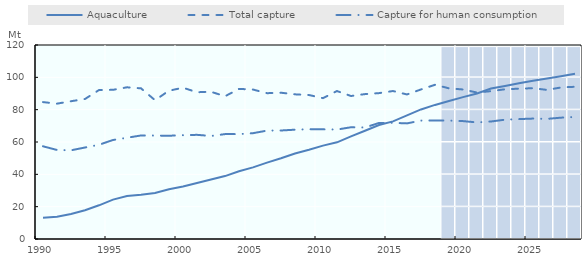
| Category | Projected1 | Projected2 | Projected3 | Projected4 | Projected5 | Projected6 |
|---|---|---|---|---|---|---|
| 1990.0 | 0 | 0 | 0 | 0 | 0 | 0 |
| 1991.0 | 0 | 0 | 0 | 0 | 0 | 0 |
| 1992.0 | 0 | 0 | 0 | 0 | 0 | 0 |
| 1993.0 | 0 | 0 | 0 | 0 | 0 | 0 |
| 1994.0 | 0 | 0 | 0 | 0 | 0 | 0 |
| 1995.0 | 0 | 0 | 0 | 0 | 0 | 0 |
| 1996.0 | 0 | 0 | 0 | 0 | 0 | 0 |
| 1997.0 | 0 | 0 | 0 | 0 | 0 | 0 |
| 1998.0 | 0 | 0 | 0 | 0 | 0 | 0 |
| 1999.0 | 0 | 0 | 0 | 0 | 0 | 0 |
| 2000.0 | 0 | 0 | 0 | 0 | 0 | 0 |
| 2001.0 | 0 | 0 | 0 | 0 | 0 | 0 |
| 2002.0 | 0 | 0 | 0 | 0 | 0 | 0 |
| 2003.0 | 0 | 0 | 0 | 0 | 0 | 0 |
| 2004.0 | 0 | 0 | 0 | 0 | 0 | 0 |
| 2005.0 | 0 | 0 | 0 | 0 | 0 | 0 |
| 2006.0 | 0 | 0 | 0 | 0 | 0 | 0 |
| 2007.0 | 0 | 0 | 0 | 0 | 0 | 0 |
| 2008.0 | 0 | 0 | 0 | 0 | 0 | 0 |
| 2009.0 | 0 | 0 | 0 | 0 | 0 | 0 |
| 2010.0 | 0 | 0 | 0 | 0 | 0 | 0 |
| 2011.0 | 0 | 0 | 0 | 0 | 0 | 0 |
| 2012.0 | 0 | 0 | 0 | 0 | 0 | 0 |
| 2013.0 | 0 | 0 | 0 | 0 | 0 | 0 |
| 2014.0 | 0 | 0 | 0 | 0 | 0 | 0 |
| 2015.0 | 0 | 0 | 0 | 0 | 0 | 0 |
| 2016.0 | 0 | 0 | 0 | 0 | 0 | 0 |
| 2017.0 | 0 | 0 | 0 | 0 | 0 | 0 |
| 2018.0 | 0 | 0 | 0 | 0 | 0 | 0 |
| 2019.0 | 1 | 1 | 1 | 1 | 1 | 0.95 |
| 2020.0 | 1 | 1 | 1 | 1 | 1 | 0.95 |
| 2021.0 | 1 | 1 | 1 | 1 | 1 | 0.95 |
| 2022.0 | 1 | 1 | 1 | 1 | 1 | 0.95 |
| 2023.0 | 1 | 1 | 1 | 1 | 1 | 0.95 |
| 2024.0 | 1 | 1 | 1 | 1 | 1 | 0.95 |
| 2025.0 | 1 | 1 | 1 | 1 | 1 | 0.95 |
| 2026.0 | 1 | 1 | 1 | 1 | 1 | 0.95 |
| 2027.0 | 1 | 1 | 1 | 1 | 1 | 0.95 |
| 2028.0 | 1 | 1 | 1 | 1 | 1 | 0.95 |